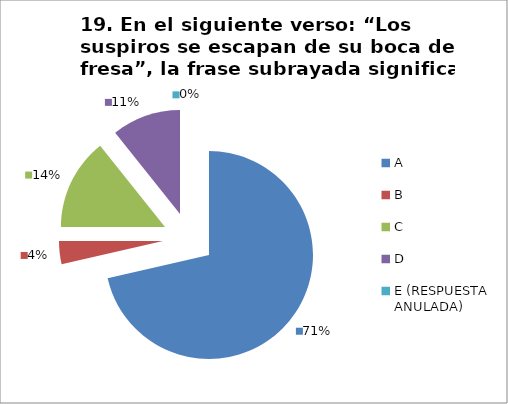
| Category | CANTIDAD DE RESPUESTAS PREGUNTA (19) | PORCENTAJE |
|---|---|---|
| A | 20 | 0.714 |
| B | 1 | 0.036 |
| C | 4 | 0.143 |
| D | 3 | 0.107 |
| E (RESPUESTA ANULADA) | 0 | 0 |